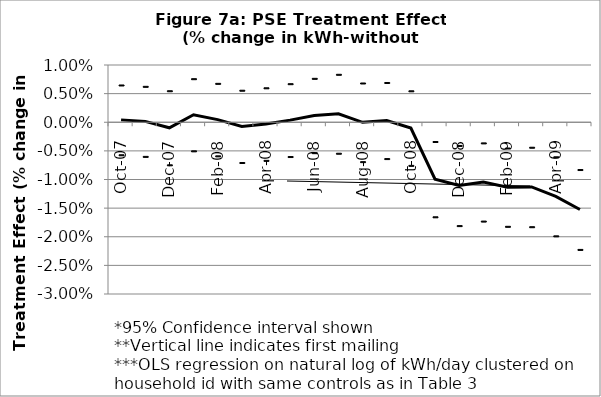
| Category | Treatment | 2 SD below | 2 SD above |
|---|---|---|---|
| 2007-10-01 | 0 | -0.006 | 0.007 |
| 2007-11-01 | 0 | -0.006 | 0.006 |
| 2007-12-01 | -0.001 | -0.007 | 0.006 |
| 2008-01-01 | 0.001 | -0.005 | 0.008 |
| 2008-02-01 | 0 | -0.006 | 0.007 |
| 2008-03-01 | -0.001 | -0.007 | 0.006 |
| 2008-04-01 | 0 | -0.007 | 0.006 |
| 2008-05-01 | 0 | -0.006 | 0.007 |
| 2008-06-01 | 0.001 | -0.005 | 0.008 |
| 2008-07-01 | 0.001 | -0.005 | 0.008 |
| 2008-08-01 | 0 | -0.007 | 0.007 |
| 2008-09-01 | 0 | -0.006 | 0.007 |
| 2008-10-01 | -0.001 | -0.008 | 0.005 |
| 2008-11-01 | -0.01 | -0.017 | -0.003 |
| 2008-12-01 | -0.011 | -0.018 | -0.004 |
| 2009-01-01 | -0.01 | -0.017 | -0.004 |
| 2009-02-01 | -0.011 | -0.018 | -0.005 |
| 2009-03-01 | -0.011 | -0.018 | -0.004 |
| 2009-04-01 | -0.013 | -0.02 | -0.006 |
| 2009-05-01 | -0.015 | -0.022 | -0.008 |